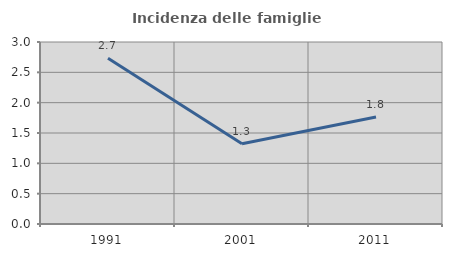
| Category | Incidenza delle famiglie numerose |
|---|---|
| 1991.0 | 2.733 |
| 2001.0 | 1.323 |
| 2011.0 | 1.764 |